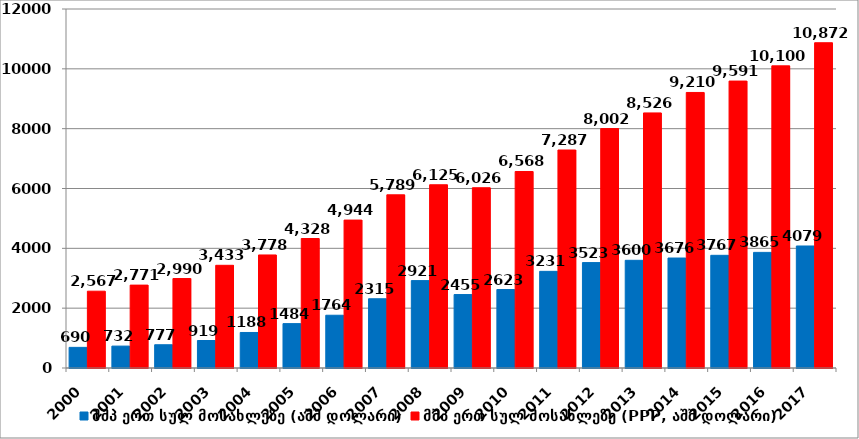
| Category | მშპ ერთ სულ მოსახლეზე (აშშ დოლარი) | მშპ ერთ სულ მოსახლეზე (PPP, აშშ დოლარი) |
|---|---|---|
| 2000.0 | 689.722 | 2567.096 |
| 2001.0 | 731.82 | 2770.522 |
| 2002.0 | 777.264 | 2990.347 |
| 2003.0 | 918.993 | 3432.625 |
| 2004.0 | 1187.597 | 3778.259 |
| 2005.0 | 1483.508 | 4328.042 |
| 2006.0 | 1763.507 | 4944.11 |
| 2007.0 | 2314.588 | 5788.621 |
| 2008.0 | 2921.097 | 6124.74 |
| 2009.0 | 2455.205 | 6025.587 |
| 2010.0 | 2622.964 | 6568.292 |
| 2011.0 | 3230.675 | 7286.867 |
| 2012.0 | 3523.4 | 8002.44 |
| 2013.0 | 3599.597 | 8525.998 |
| 2014.0 | 3676.169 | 9210.155 |
| 2015.0 | 3766.629 | 9590.963 |
| 2016.0 | 3864.616 | 10099.867 |
| 2017.0 | 4078.5 | 10872 |